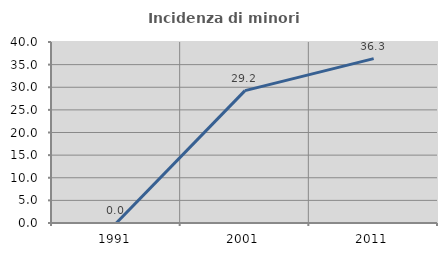
| Category | Incidenza di minori stranieri |
|---|---|
| 1991.0 | 0 |
| 2001.0 | 29.245 |
| 2011.0 | 36.319 |